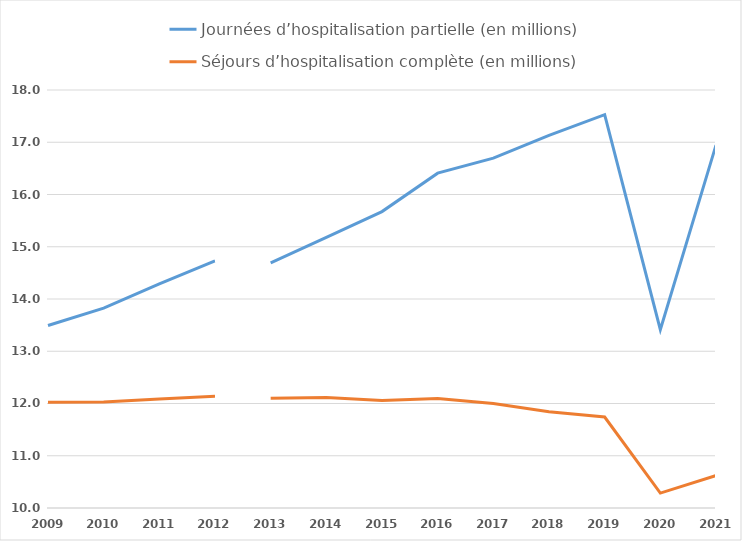
| Category | Journées d’hospitalisation partielle (en millions) | Séjours d’hospitalisation complète (en millions) |
|---|---|---|
| 2009.0 | 13.492 | 12.024 |
| 2010.0 | 13.826 | 12.031 |
| 2011.0 | 14.287 | 12.088 |
| 2012.0 | 14.729 | 12.137 |
| 2013.0 | 14.693 | 12.101 |
| 2014.0 | 15.178 | 12.115 |
| 2015.0 | 15.673 | 12.059 |
| 2016.0 | 16.408 | 12.094 |
| 2017.0 | 16.696 | 11.998 |
| 2018.0 | 17.131 | 11.841 |
| 2019.0 | 17.528 | 11.741 |
| 2020.0 | 13.415 | 10.285 |
| 2021.0 | 16.946 | 10.62 |